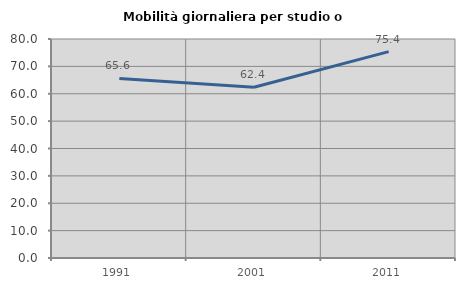
| Category | Mobilità giornaliera per studio o lavoro |
|---|---|
| 1991.0 | 65.583 |
| 2001.0 | 62.36 |
| 2011.0 | 75.372 |